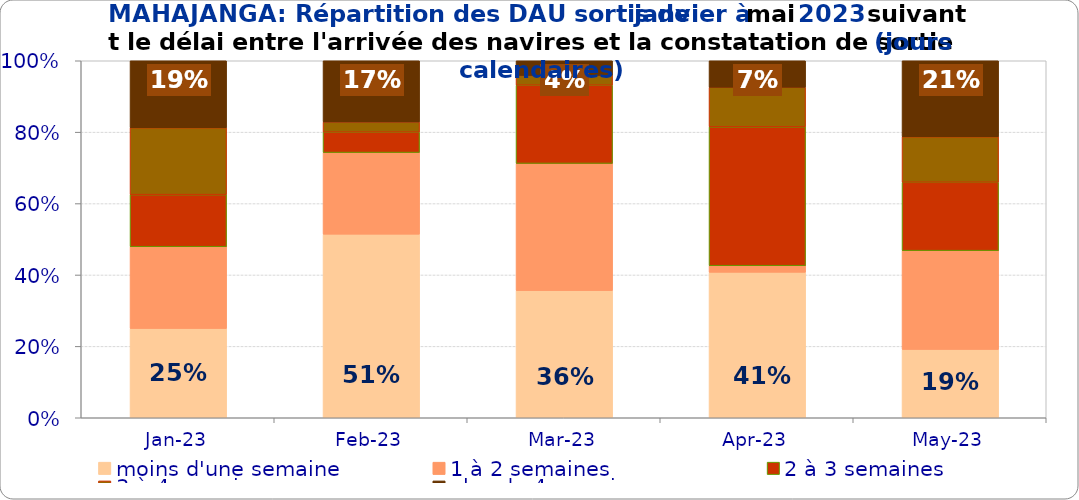
| Category | moins d'une semaine | 1 à 2 semaines | 2 à 3 semaines | 3 à 4 semaines | plus de 4 semaines |
|---|---|---|---|---|---|
| 2023-01-01 | 0.25 | 0.229 | 0.146 | 0.188 | 0.188 |
| 2023-02-01 | 0.514 | 0.229 | 0.057 | 0.029 | 0.171 |
| 2023-03-01 | 0.356 | 0.356 | 0.219 | 0.027 | 0.041 |
| 2023-04-01 | 0.407 | 0.019 | 0.389 | 0.111 | 0.074 |
| 2023-05-01 | 0.191 | 0.277 | 0.191 | 0.128 | 0.213 |